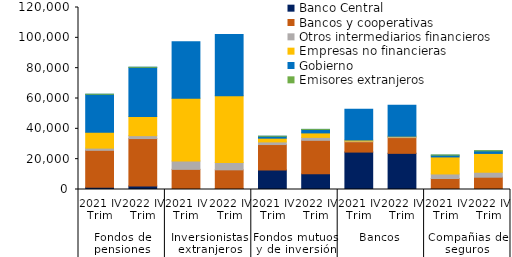
| Category | Banco Central | Bancos y cooperativas | Otros intermediarios financieros | Empresas no financieras | Gobierno  | Emisores extranjeros |
|---|---|---|---|---|---|---|
| 0 | 1467.745 | 24364.317 | 1458.286 | 10453.553 | 25020.313 | 31.11 |
| 1 | 2319.069 | 31263.656 | 1914.305 | 12601.158 | 32443.075 | 35.111 |
| 2 | 8.58 | 13265.521 | 5514.895 | 41330.093 | 37372.144 | 0 |
| 3 | 527.928 | 12438.033 | 4791.034 | 44087.248 | 40430.584 | 0 |
| 4 | 12858.524 | 16780.857 | 1732.823 | 2474.805 | 1265.339 | 0.156 |
| 5 | 10308.337 | 22109.901 | 1952.377 | 2937.933 | 2313.941 | 0.176 |
| 6 | 24673.521 | 6810.498 | 450.701 | 673.218 | 20324.362 | 0 |
| 7 | 23834.964 | 10377.963 | 527.069 | 437.68 | 20371.824 | 0 |
| 8 | 218.441 | 7023.588 | 2998.49 | 11234.393 | 1154.334 | 124.285 |
| 9 | 86.635 | 8023.169 | 3278.452 | 12398.506 | 1670.133 | 140.268 |